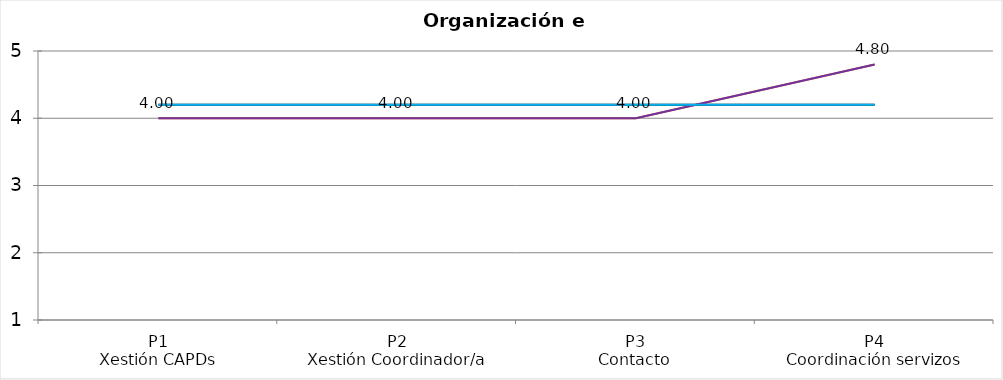
| Category | Valoración (1-5) | MEDIA |
|---|---|---|
| P1
Xestión CAPDs | 4 | 4.2 |
| P2
Xestión Coordinador/a | 4 | 4.2 |
| P3
Contacto | 4 | 4.2 |
| P4
Coordinación servizos | 4.8 | 4.2 |